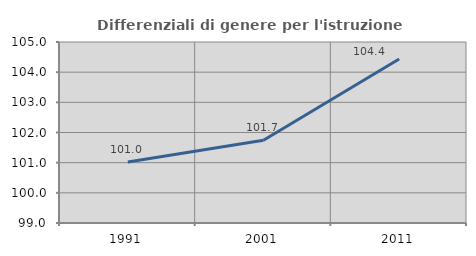
| Category | Differenziali di genere per l'istruzione superiore |
|---|---|
| 1991.0 | 101.02 |
| 2001.0 | 101.743 |
| 2011.0 | 104.438 |